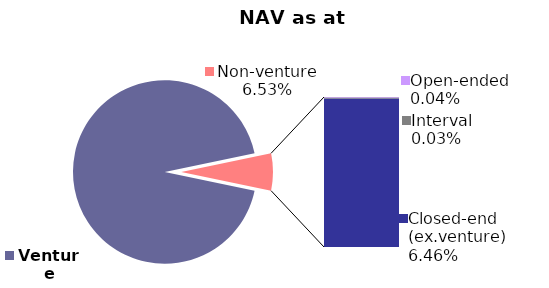
| Category | 43465 |
|---|---|
| Venture | 0.935 |
| Open-ended | 0 |
| Interval | 0 |
| Closed-end (ex.venture) | 0.065 |